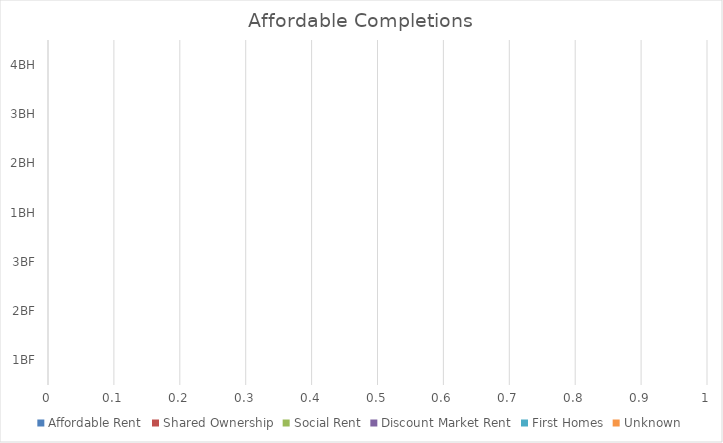
| Category | Affordable Rent | Shared Ownership | Social Rent | Discount Market Rent | First Homes | Unknown |
|---|---|---|---|---|---|---|
| 1BF | 0 | 0 | 0 | 0 | 0 | 0 |
| 2BF | 0 | 0 | 0 | 0 | 0 | 0 |
| 3BF | 0 | 0 | 0 | 0 | 0 | 0 |
| 1BH | 0 | 0 | 0 | 0 | 0 | 0 |
| 2BH | 0 | 0 | 0 | 0 | 0 | 0 |
| 3BH | 0 | 0 | 0 | 0 | 0 | 0 |
| 4BH | 0 | 0 | 0 | 0 | 0 | 0 |